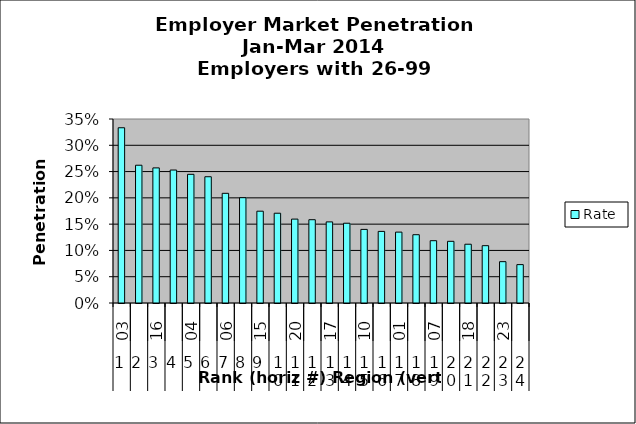
| Category | Rate |
|---|---|
| 0 | 0.333 |
| 1 | 0.262 |
| 2 | 0.257 |
| 3 | 0.253 |
| 4 | 0.245 |
| 5 | 0.24 |
| 6 | 0.209 |
| 7 | 0.2 |
| 8 | 0.175 |
| 9 | 0.171 |
| 10 | 0.16 |
| 11 | 0.158 |
| 12 | 0.154 |
| 13 | 0.152 |
| 14 | 0.14 |
| 15 | 0.136 |
| 16 | 0.135 |
| 17 | 0.13 |
| 18 | 0.119 |
| 19 | 0.117 |
| 20 | 0.112 |
| 21 | 0.109 |
| 22 | 0.079 |
| 23 | 0.073 |